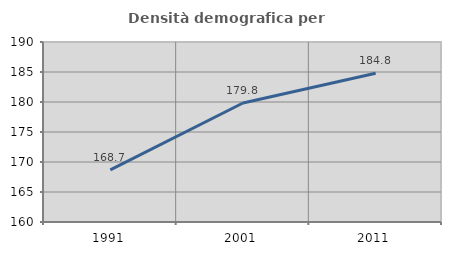
| Category | Densità demografica |
|---|---|
| 1991.0 | 168.684 |
| 2001.0 | 179.833 |
| 2011.0 | 184.803 |